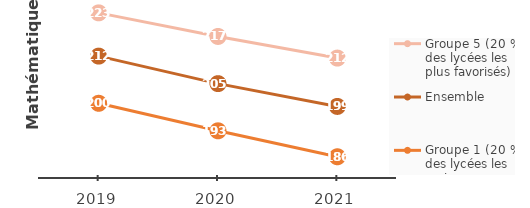
| Category | Groupe 5 (20 % des lycées les plus favorisés) | Ensemble | Groupe 1 (20 % des lycées les moins favorisés) |
|---|---|---|---|
| 2019.0 | 223 | 212 | 200 |
| 2020.0 | 217 | 205 | 193 |
| 2021.0 | 211.5 | 199.2 | 186.4 |